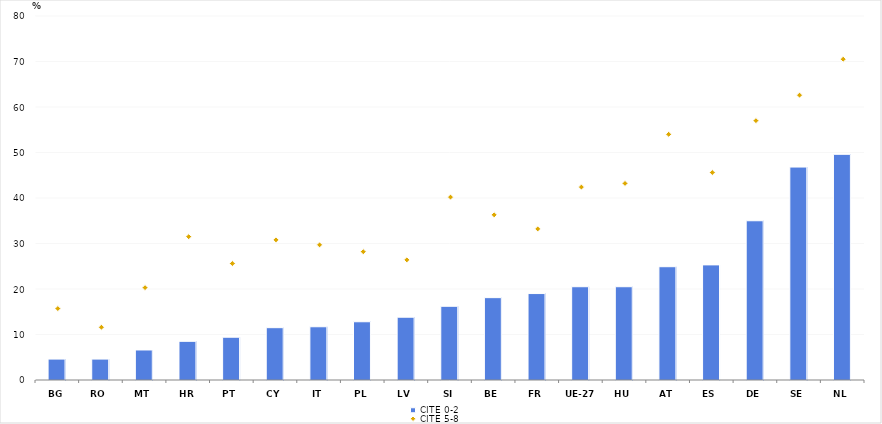
| Category | CITE 0-2 |
|---|---|
| BG | 4.6 |
| RO | 4.6 |
| MT | 6.6 |
| HR | 8.5 |
| PT | 9.4 |
| CY | 11.5 |
| IT | 11.7 |
| PL | 12.8 |
| LV | 13.8 |
| SI | 16.2 |
| BE | 18.1 |
| FR | 19 |
| UE-27 | 20.5 |
| HU | 20.5 |
| AT | 24.9 |
| ES | 25.3 |
| DE | 35 |
| SE | 46.8 |
| NL | 49.6 |